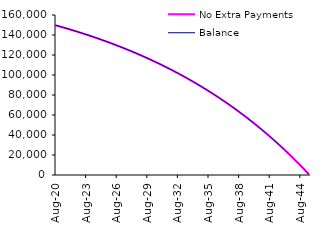
| Category | No Extra Payments | Balance |
|---|---|---|
| 2020-08-01 | 149764.16 | 149764.16 |
| 2020-09-01 | 149527.25 | 149527.25 |
| 2020-10-01 | 149289.27 | 149289.27 |
| 2020-11-01 | 149050.21 | 149050.21 |
| 2020-12-01 | 148810.07 | 148810.07 |
| 2021-01-01 | 148568.84 | 148568.84 |
| 2021-02-01 | 148326.52 | 148326.52 |
| 2021-03-01 | 148083.1 | 148083.1 |
| 2021-04-01 | 147838.58 | 147838.58 |
| 2021-05-01 | 147592.95 | 147592.95 |
| 2021-06-01 | 147346.2 | 147346.2 |
| 2021-07-01 | 147098.34 | 147098.34 |
| 2021-08-01 | 146849.35 | 146849.35 |
| 2021-09-01 | 146599.23 | 146599.23 |
| 2021-10-01 | 146347.98 | 146347.98 |
| 2021-11-01 | 146095.59 | 146095.59 |
| 2021-12-01 | 145842.06 | 145842.06 |
| 2022-01-01 | 145587.38 | 145587.38 |
| 2022-02-01 | 145331.55 | 145331.55 |
| 2022-03-01 | 145074.56 | 145074.56 |
| 2022-04-01 | 144816.4 | 144816.4 |
| 2022-05-01 | 144557.07 | 144557.07 |
| 2022-06-01 | 144296.57 | 144296.57 |
| 2022-07-01 | 144034.89 | 144034.89 |
| 2022-08-01 | 143772.02 | 143772.02 |
| 2022-09-01 | 143507.96 | 143507.96 |
| 2022-10-01 | 143242.7 | 143242.7 |
| 2022-11-01 | 142976.24 | 142976.24 |
| 2022-12-01 | 142708.57 | 142708.57 |
| 2023-01-01 | 142439.69 | 142439.69 |
| 2023-02-01 | 142169.59 | 142169.59 |
| 2023-03-01 | 141898.27 | 141898.27 |
| 2023-04-01 | 141625.72 | 141625.72 |
| 2023-05-01 | 141351.93 | 141351.93 |
| 2023-06-01 | 141076.9 | 141076.9 |
| 2023-07-01 | 140800.63 | 140800.63 |
| 2023-08-01 | 140523.1 | 140523.1 |
| 2023-09-01 | 140244.32 | 140244.32 |
| 2023-10-01 | 139964.27 | 139964.27 |
| 2023-11-01 | 139682.95 | 139682.95 |
| 2023-12-01 | 139400.36 | 139400.36 |
| 2024-01-01 | 139116.49 | 139116.49 |
| 2024-02-01 | 138831.33 | 138831.33 |
| 2024-03-01 | 138544.88 | 138544.88 |
| 2024-04-01 | 138257.13 | 138257.13 |
| 2024-05-01 | 137968.08 | 137968.08 |
| 2024-06-01 | 137677.72 | 137677.72 |
| 2024-07-01 | 137386.04 | 137386.04 |
| 2024-08-01 | 137093.04 | 137093.04 |
| 2024-09-01 | 136798.71 | 136798.71 |
| 2024-10-01 | 136503.05 | 136503.05 |
| 2024-11-01 | 136206.05 | 136206.05 |
| 2024-12-01 | 135907.7 | 135907.7 |
| 2025-01-01 | 135608 | 135608 |
| 2025-02-01 | 135306.94 | 135306.94 |
| 2025-03-01 | 135004.52 | 135004.52 |
| 2025-04-01 | 134700.73 | 134700.73 |
| 2025-05-01 | 134395.56 | 134395.56 |
| 2025-06-01 | 134089.01 | 134089.01 |
| 2025-07-01 | 133781.07 | 133781.07 |
| 2025-08-01 | 133471.73 | 133471.73 |
| 2025-09-01 | 133160.99 | 133160.99 |
| 2025-10-01 | 132848.84 | 132848.84 |
| 2025-11-01 | 132535.28 | 132535.28 |
| 2025-12-01 | 132220.3 | 132220.3 |
| 2026-01-01 | 131903.89 | 131903.89 |
| 2026-02-01 | 131586.05 | 131586.05 |
| 2026-03-01 | 131266.77 | 131266.77 |
| 2026-04-01 | 130946.04 | 130946.04 |
| 2026-05-01 | 130623.86 | 130623.86 |
| 2026-06-01 | 130300.22 | 130300.22 |
| 2026-07-01 | 129975.11 | 129975.11 |
| 2026-08-01 | 129648.53 | 129648.53 |
| 2026-09-01 | 129320.47 | 129320.47 |
| 2026-10-01 | 128990.92 | 128990.92 |
| 2026-11-01 | 128659.88 | 128659.88 |
| 2026-12-01 | 128327.34 | 128327.34 |
| 2027-01-01 | 127993.29 | 127993.29 |
| 2027-02-01 | 127657.72 | 127657.72 |
| 2027-03-01 | 127320.63 | 127320.63 |
| 2027-04-01 | 126982.02 | 126982.02 |
| 2027-05-01 | 126641.87 | 126641.87 |
| 2027-06-01 | 126300.18 | 126300.18 |
| 2027-07-01 | 125956.94 | 125956.94 |
| 2027-08-01 | 125612.15 | 125612.15 |
| 2027-09-01 | 125265.79 | 125265.79 |
| 2027-10-01 | 124917.86 | 124917.86 |
| 2027-11-01 | 124568.36 | 124568.36 |
| 2027-12-01 | 124217.27 | 124217.27 |
| 2028-01-01 | 123864.59 | 123864.59 |
| 2028-02-01 | 123510.31 | 123510.31 |
| 2028-03-01 | 123154.43 | 123154.43 |
| 2028-04-01 | 122796.94 | 122796.94 |
| 2028-05-01 | 122437.83 | 122437.83 |
| 2028-06-01 | 122077.09 | 122077.09 |
| 2028-07-01 | 121714.71 | 121714.71 |
| 2028-08-01 | 121350.69 | 121350.69 |
| 2028-09-01 | 120985.02 | 120985.02 |
| 2028-10-01 | 120617.7 | 120617.7 |
| 2028-11-01 | 120248.71 | 120248.71 |
| 2028-12-01 | 119878.05 | 119878.05 |
| 2029-01-01 | 119505.71 | 119505.71 |
| 2029-02-01 | 119131.68 | 119131.68 |
| 2029-03-01 | 118755.96 | 118755.96 |
| 2029-04-01 | 118378.53 | 118378.53 |
| 2029-05-01 | 117999.39 | 117999.39 |
| 2029-06-01 | 117618.54 | 117618.54 |
| 2029-07-01 | 117235.96 | 117235.96 |
| 2029-08-01 | 116851.65 | 116851.65 |
| 2029-09-01 | 116465.59 | 116465.59 |
| 2029-10-01 | 116077.78 | 116077.78 |
| 2029-11-01 | 115688.22 | 115688.22 |
| 2029-12-01 | 115296.89 | 115296.89 |
| 2030-01-01 | 114903.79 | 114903.79 |
| 2030-02-01 | 114508.91 | 114508.91 |
| 2030-03-01 | 114112.24 | 114112.24 |
| 2030-04-01 | 113713.77 | 113713.77 |
| 2030-05-01 | 113313.49 | 113313.49 |
| 2030-06-01 | 112911.4 | 112911.4 |
| 2030-07-01 | 112507.49 | 112507.49 |
| 2030-08-01 | 112101.75 | 112101.75 |
| 2030-09-01 | 111694.17 | 111694.17 |
| 2030-10-01 | 111284.74 | 111284.74 |
| 2030-11-01 | 110873.46 | 110873.46 |
| 2030-12-01 | 110460.31 | 110460.31 |
| 2031-01-01 | 110045.29 | 110045.29 |
| 2031-02-01 | 109628.39 | 109628.39 |
| 2031-03-01 | 109209.6 | 109209.6 |
| 2031-04-01 | 108788.91 | 108788.91 |
| 2031-05-01 | 108366.32 | 108366.32 |
| 2031-06-01 | 107941.81 | 107941.81 |
| 2031-07-01 | 107515.38 | 107515.38 |
| 2031-08-01 | 107087.02 | 107087.02 |
| 2031-09-01 | 106656.71 | 106656.71 |
| 2031-10-01 | 106224.45 | 106224.45 |
| 2031-11-01 | 105790.24 | 105790.24 |
| 2031-12-01 | 105354.06 | 105354.06 |
| 2032-01-01 | 104915.9 | 104915.9 |
| 2032-02-01 | 104475.76 | 104475.76 |
| 2032-03-01 | 104033.62 | 104033.62 |
| 2032-04-01 | 103589.48 | 103589.48 |
| 2032-05-01 | 103143.32 | 103143.32 |
| 2032-06-01 | 102695.14 | 102695.14 |
| 2032-07-01 | 102244.93 | 102244.93 |
| 2032-08-01 | 101792.68 | 101792.68 |
| 2032-09-01 | 101338.38 | 101338.38 |
| 2032-10-01 | 100882.02 | 100882.02 |
| 2032-11-01 | 100423.6 | 100423.6 |
| 2032-12-01 | 99963.1 | 99963.1 |
| 2033-01-01 | 99500.51 | 99500.51 |
| 2033-02-01 | 99035.82 | 99035.82 |
| 2033-03-01 | 98569.03 | 98569.03 |
| 2033-04-01 | 98100.12 | 98100.12 |
| 2033-05-01 | 97629.09 | 97629.09 |
| 2033-06-01 | 97155.92 | 97155.92 |
| 2033-07-01 | 96680.61 | 96680.61 |
| 2033-08-01 | 96203.15 | 96203.15 |
| 2033-09-01 | 95723.52 | 95723.52 |
| 2033-10-01 | 95241.72 | 95241.72 |
| 2033-11-01 | 94757.74 | 94757.74 |
| 2033-12-01 | 94271.56 | 94271.56 |
| 2034-01-01 | 93783.18 | 93783.18 |
| 2034-02-01 | 93292.59 | 93292.59 |
| 2034-03-01 | 92799.77 | 92799.77 |
| 2034-04-01 | 92304.72 | 92304.72 |
| 2034-05-01 | 91807.43 | 91807.43 |
| 2034-06-01 | 91307.88 | 91307.88 |
| 2034-07-01 | 90806.07 | 90806.07 |
| 2034-08-01 | 90301.98 | 90301.98 |
| 2034-09-01 | 89795.61 | 89795.61 |
| 2034-10-01 | 89286.95 | 89286.95 |
| 2034-11-01 | 88775.98 | 88775.98 |
| 2034-12-01 | 88262.69 | 88262.69 |
| 2035-01-01 | 87747.08 | 87747.08 |
| 2035-02-01 | 87229.13 | 87229.13 |
| 2035-03-01 | 86708.83 | 86708.83 |
| 2035-04-01 | 86186.18 | 86186.18 |
| 2035-05-01 | 85661.16 | 85661.16 |
| 2035-06-01 | 85133.76 | 85133.76 |
| 2035-07-01 | 84603.97 | 84603.97 |
| 2035-08-01 | 84071.78 | 84071.78 |
| 2035-09-01 | 83537.18 | 83537.18 |
| 2035-10-01 | 83000.15 | 83000.15 |
| 2035-11-01 | 82460.69 | 82460.69 |
| 2035-12-01 | 81918.79 | 81918.79 |
| 2036-01-01 | 81374.43 | 81374.43 |
| 2036-02-01 | 80827.6 | 80827.6 |
| 2036-03-01 | 80278.29 | 80278.29 |
| 2036-04-01 | 79726.5 | 79726.5 |
| 2036-05-01 | 79172.21 | 79172.21 |
| 2036-06-01 | 78615.4 | 78615.4 |
| 2036-07-01 | 78056.07 | 78056.07 |
| 2036-08-01 | 77494.21 | 77494.21 |
| 2036-09-01 | 76929.8 | 76929.8 |
| 2036-10-01 | 76362.83 | 76362.83 |
| 2036-11-01 | 75793.29 | 75793.29 |
| 2036-12-01 | 75221.17 | 75221.17 |
| 2037-01-01 | 74646.46 | 74646.46 |
| 2037-02-01 | 74069.14 | 74069.14 |
| 2037-03-01 | 73489.21 | 73489.21 |
| 2037-04-01 | 72906.65 | 72906.65 |
| 2037-05-01 | 72321.45 | 72321.45 |
| 2037-06-01 | 71733.6 | 71733.6 |
| 2037-07-01 | 71143.08 | 71143.08 |
| 2037-08-01 | 70549.89 | 70549.89 |
| 2037-09-01 | 69954.01 | 69954.01 |
| 2037-10-01 | 69355.43 | 69355.43 |
| 2037-11-01 | 68754.14 | 68754.14 |
| 2037-12-01 | 68150.12 | 68150.12 |
| 2038-01-01 | 67543.36 | 67543.36 |
| 2038-02-01 | 66933.86 | 66933.86 |
| 2038-03-01 | 66321.59 | 66321.59 |
| 2038-04-01 | 65706.55 | 65706.55 |
| 2038-05-01 | 65088.72 | 65088.72 |
| 2038-06-01 | 64468.09 | 64468.09 |
| 2038-07-01 | 63844.65 | 63844.65 |
| 2038-08-01 | 63218.38 | 63218.38 |
| 2038-09-01 | 62589.28 | 62589.28 |
| 2038-10-01 | 61957.32 | 61957.32 |
| 2038-11-01 | 61322.5 | 61322.5 |
| 2038-12-01 | 60684.8 | 60684.8 |
| 2039-01-01 | 60044.21 | 60044.21 |
| 2039-02-01 | 59400.72 | 59400.72 |
| 2039-03-01 | 58754.32 | 58754.32 |
| 2039-04-01 | 58104.99 | 58104.99 |
| 2039-05-01 | 57452.71 | 57452.71 |
| 2039-06-01 | 56797.48 | 56797.48 |
| 2039-07-01 | 56139.28 | 56139.28 |
| 2039-08-01 | 55478.1 | 55478.1 |
| 2039-09-01 | 54813.92 | 54813.92 |
| 2039-10-01 | 54146.73 | 54146.73 |
| 2039-11-01 | 53476.52 | 53476.52 |
| 2039-12-01 | 52803.27 | 52803.27 |
| 2040-01-01 | 52126.97 | 52126.97 |
| 2040-02-01 | 51447.6 | 51447.6 |
| 2040-03-01 | 50765.15 | 50765.15 |
| 2040-04-01 | 50079.61 | 50079.61 |
| 2040-05-01 | 49390.96 | 49390.96 |
| 2040-06-01 | 48699.19 | 48699.19 |
| 2040-07-01 | 48004.29 | 48004.29 |
| 2040-08-01 | 47306.24 | 47306.24 |
| 2040-09-01 | 46605.03 | 46605.03 |
| 2040-10-01 | 45900.64 | 45900.64 |
| 2040-11-01 | 45193.06 | 45193.06 |
| 2040-12-01 | 44482.27 | 44482.27 |
| 2041-01-01 | 43768.26 | 43768.26 |
| 2041-02-01 | 43051.01 | 43051.01 |
| 2041-03-01 | 42330.51 | 42330.51 |
| 2041-04-01 | 41606.75 | 41606.75 |
| 2041-05-01 | 40879.71 | 40879.71 |
| 2041-06-01 | 40149.37 | 40149.37 |
| 2041-07-01 | 39415.72 | 39415.72 |
| 2041-08-01 | 38678.75 | 38678.75 |
| 2041-09-01 | 37938.44 | 37938.44 |
| 2041-10-01 | 37194.77 | 37194.77 |
| 2041-11-01 | 36447.73 | 36447.73 |
| 2041-12-01 | 35697.31 | 35697.31 |
| 2042-01-01 | 34943.49 | 34943.49 |
| 2042-02-01 | 34186.25 | 34186.25 |
| 2042-03-01 | 33425.58 | 33425.58 |
| 2042-04-01 | 32661.46 | 32661.46 |
| 2042-05-01 | 31893.88 | 31893.88 |
| 2042-06-01 | 31122.82 | 31122.82 |
| 2042-07-01 | 30348.27 | 30348.27 |
| 2042-08-01 | 29570.21 | 29570.21 |
| 2042-09-01 | 28788.62 | 28788.62 |
| 2042-10-01 | 28003.49 | 28003.49 |
| 2042-11-01 | 27214.8 | 27214.8 |
| 2042-12-01 | 26422.54 | 26422.54 |
| 2043-01-01 | 25626.69 | 25626.69 |
| 2043-02-01 | 24827.23 | 24827.23 |
| 2043-03-01 | 24024.15 | 24024.15 |
| 2043-04-01 | 23217.43 | 23217.43 |
| 2043-05-01 | 22407.05 | 22407.05 |
| 2043-06-01 | 21593 | 21593 |
| 2043-07-01 | 20775.26 | 20775.26 |
| 2043-08-01 | 19953.82 | 19953.82 |
| 2043-09-01 | 19128.65 | 19128.65 |
| 2043-10-01 | 18299.74 | 18299.74 |
| 2043-11-01 | 17467.08 | 17467.08 |
| 2043-12-01 | 16630.65 | 16630.65 |
| 2044-01-01 | 15790.42 | 15790.42 |
| 2044-02-01 | 14946.39 | 14946.39 |
| 2044-03-01 | 14098.53 | 14098.53 |
| 2044-04-01 | 13246.83 | 13246.83 |
| 2044-05-01 | 12391.27 | 12391.27 |
| 2044-06-01 | 11531.83 | 11531.83 |
| 2044-07-01 | 10668.5 | 10668.5 |
| 2044-08-01 | 9801.26 | 9801.26 |
| 2044-09-01 | 8930.09 | 8930.09 |
| 2044-10-01 | 8054.97 | 8054.97 |
| 2044-11-01 | 7175.88 | 7175.88 |
| 2044-12-01 | 6292.81 | 6292.81 |
| 2045-01-01 | 5405.74 | 5405.74 |
| 2045-02-01 | 4514.65 | 4514.65 |
| 2045-03-01 | 3619.52 | 3619.52 |
| 2045-04-01 | 2720.33 | 2720.33 |
| 2045-05-01 | 1817.07 | 1817.07 |
| 2045-06-01 | 909.71 | 909.71 |
| 2045-07-01 | 0 | 0 |